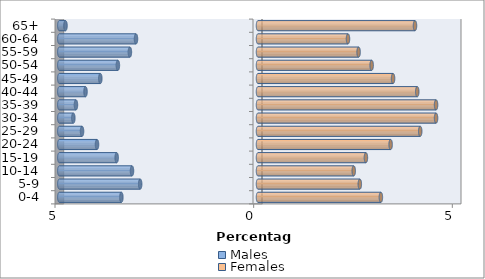
| Category | Males | Females |
|---|---|---|
| 0-4 | -3.439 | 3.093 |
| 5-9 | -2.966 | 2.563 |
| 10-14 | -3.172 | 2.409 |
| 15-19 | -3.557 | 2.716 |
| 20-24 | -4.052 | 3.338 |
| 25-29 | -4.429 | 4.083 |
| 30-34 | -4.648 | 4.481 |
| 35-39 | -4.582 | 4.481 |
| 40-44 | -4.341 | 4.008 |
| 45-49 | -3.969 | 3.399 |
| 50-54 | -3.526 | 2.861 |
| 55-59 | -3.224 | 2.532 |
| 60-64 | -3.071 | 2.265 |
| 65+ | -4.845 | 3.951 |